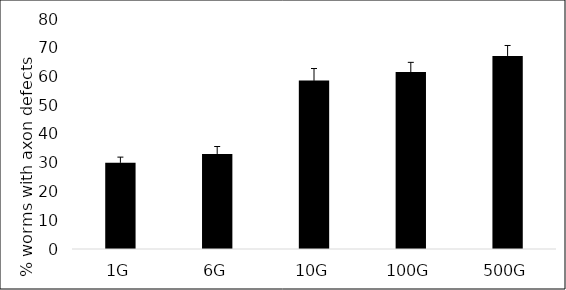
| Category | 1G |
|---|---|
| 1G | 29.981 |
| 6G | 33.058 |
| 10G | 58.613 |
| 100G | 61.527 |
| 500G | 67.157 |